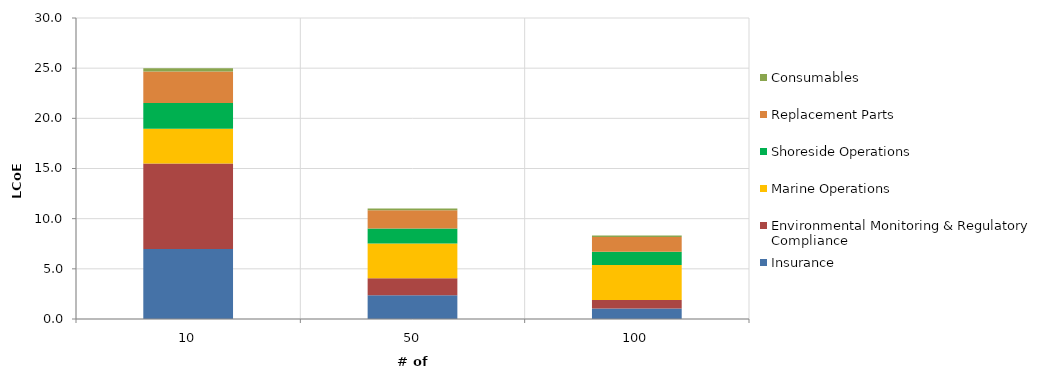
| Category | Insurance | Environmental Monitoring & Regulatory Compliance | Marine Operations | Shoreside Operations | Replacement Parts | Consumables |
|---|---|---|---|---|---|---|
| 10.0 | 6.975 | 8.513 | 3.464 | 2.583 | 3.135 | 0.314 |
| 50.0 | 2.363 | 1.703 | 3.464 | 1.48 | 1.821 | 0.182 |
| 100.0 | 1.054 | 0.851 | 3.464 | 1.327 | 1.477 | 0.148 |